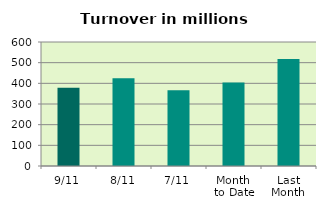
| Category | Series 0 |
|---|---|
| 9/11 | 378.638 |
| 8/11 | 424.029 |
| 7/11 | 365.989 |
| Month 
to Date | 403.847 |
| Last
Month | 517.71 |